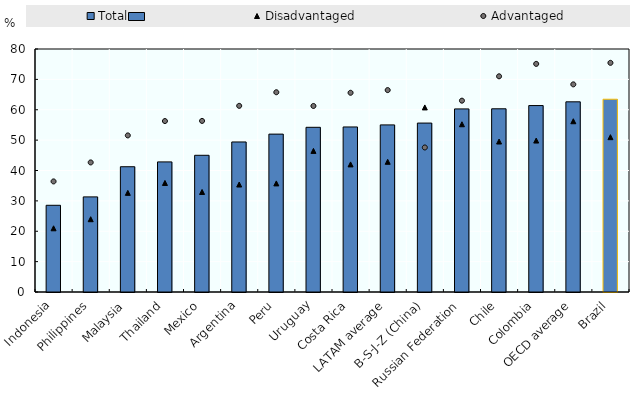
| Category | Total |
|---|---|
| Indonesia | 28.547 |
| Philippines | 31.316 |
| Malaysia | 41.244 |
| Thailand | 42.832 |
| Mexico | 45.005 |
| Argentina | 49.398 |
| Peru | 51.976 |
| Uruguay | 54.218 |
| Costa Rica | 54.333 |
| LATAM average | 55.012 |
| B-S-J-Z (China) | 55.613 |
| Russian Federation | 60.276 |
| Chile | 60.314 |
| Colombia | 61.382 |
| OECD average | 62.612 |
| Brazil | 63.466 |